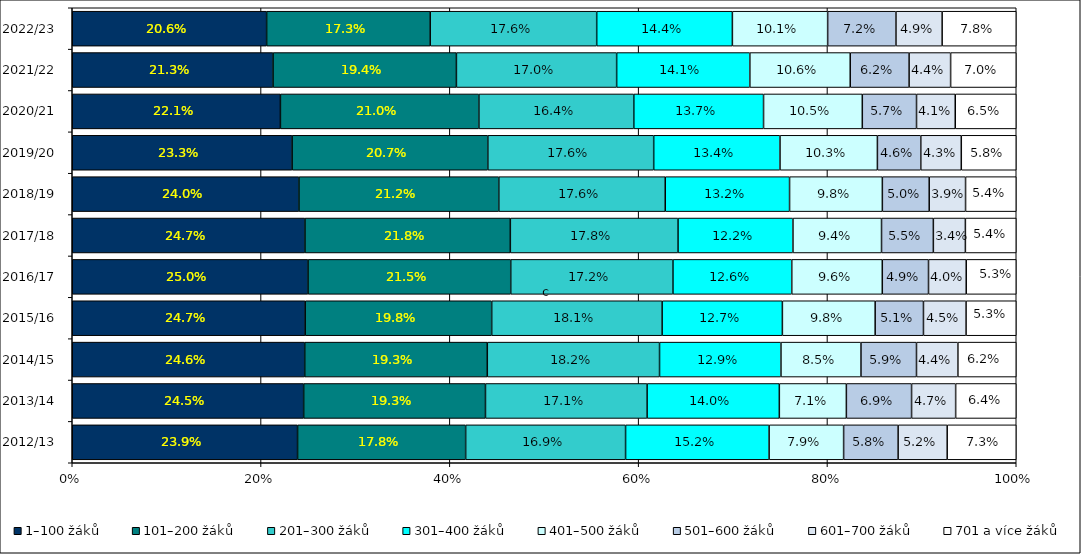
| Category | 1–100 žáků | 101–200 žáků | 201–300 žáků | 301–400 žáků | 401–500 žáků | 501–600 žáků | 601–700 žáků | 701 a více žáků |
|---|---|---|---|---|---|---|---|---|
| 2012/13 | 0.239 | 0.178 | 0.169 | 0.152 | 0.079 | 0.058 | 0.052 | 0.073 |
| 2013/14 | 0.245 | 0.193 | 0.171 | 0.14 | 0.071 | 0.069 | 0.047 | 0.064 |
| 2014/15 | 0.246 | 0.193 | 0.182 | 0.129 | 0.085 | 0.059 | 0.044 | 0.062 |
| 2015/16 | 0.247 | 0.198 | 0.181 | 0.127 | 0.098 | 0.051 | 0.045 | 0.053 |
| 2016/17 | 0.25 | 0.215 | 0.172 | 0.126 | 0.096 | 0.049 | 0.04 | 0.053 |
| 2017/18 | 0.247 | 0.218 | 0.178 | 0.122 | 0.094 | 0.055 | 0.034 | 0.054 |
| 2018/19 | 0.24 | 0.212 | 0.176 | 0.132 | 0.098 | 0.05 | 0.039 | 0.054 |
| 2019/20 | 0.233 | 0.207 | 0.176 | 0.134 | 0.103 | 0.046 | 0.043 | 0.058 |
| 2020/21 | 0.221 | 0.21 | 0.164 | 0.137 | 0.105 | 0.057 | 0.041 | 0.065 |
| 2021/22 | 0.213 | 0.194 | 0.17 | 0.141 | 0.106 | 0.062 | 0.044 | 0.07 |
| 2022/23 | 0.206 | 0.173 | 0.176 | 0.144 | 0.101 | 0.072 | 0.049 | 0.078 |